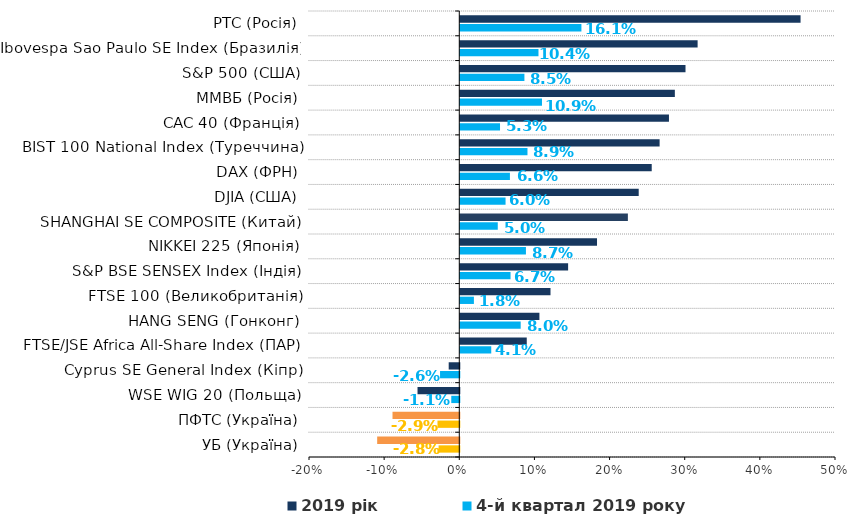
| Category | 4-й квартал 2019 року | 2019 рік |
|---|---|---|
| УБ (Україна) | -0.028 | -0.109 |
| ПФТС (Україна) | -0.029 | -0.089 |
| WSE WIG 20 (Польща) | -0.011 | -0.056 |
| Cyprus SE General Index (Кіпр) | -0.026 | -0.014 |
| FTSE/JSE Africa All-Share Index (ПАР) | 0.041 | 0.088 |
| HANG SENG (Гонконг) | 0.08 | 0.105 |
| FTSE 100 (Великобританія) | 0.018 | 0.12 |
| S&P BSE SENSEX Index (Індія) | 0.067 | 0.144 |
| NIKKEI 225 (Японія) | 0.087 | 0.182 |
| SHANGHAI SE COMPOSITE (Китай) | 0.05 | 0.223 |
| DJIA (США) | 0.06 | 0.237 |
| DAX (ФРН) | 0.066 | 0.255 |
| BIST 100 National Index (Туреччина) | 0.089 | 0.265 |
| CAC 40 (Франція) | 0.053 | 0.278 |
| ММВБ (Росія) | 0.109 | 0.286 |
| S&P 500 (США) | 0.085 | 0.3 |
| Ibovespa Sao Paulo SE Index (Бразилія) | 0.104 | 0.316 |
| РТС (Росія) | 0.161 | 0.453 |